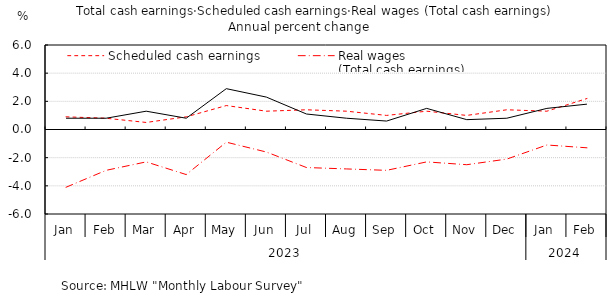
| Category | Scheduled cash earnings | Real wages
(Total cash earnings) | Total cash earnings |
|---|---|---|---|
| 0 | 0.9 | -4.1 | 0.8 |
| 1 | 0.8 | -2.9 | 0.8 |
| 2 | 0.5 | -2.3 | 1.3 |
| 3 | 0.9 | -3.2 | 0.8 |
| 4 | 1.7 | -0.9 | 2.9 |
| 5 | 1.3 | -1.6 | 2.3 |
| 6 | 1.4 | -2.7 | 1.1 |
| 7 | 1.3 | -2.8 | 0.8 |
| 8 | 1 | -2.9 | 0.6 |
| 9 | 1.3 | -2.3 | 1.5 |
| 10 | 1 | -2.5 | 0.7 |
| 11 | 1.4 | -2.1 | 0.8 |
| 12 | 1.3 | -1.1 | 1.5 |
| 13 | 2.2 | -1.3 | 1.8 |